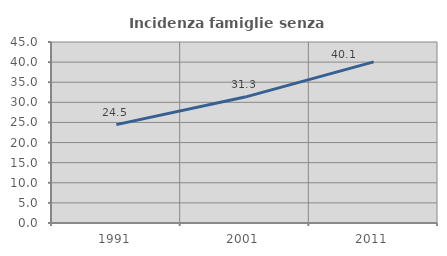
| Category | Incidenza famiglie senza nuclei |
|---|---|
| 1991.0 | 24.465 |
| 2001.0 | 31.307 |
| 2011.0 | 40.063 |